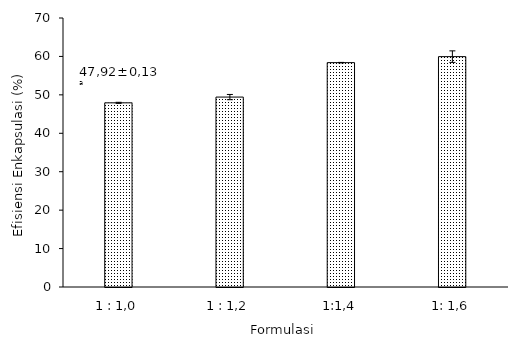
| Category | Efisiensi Enkapsulasi (%) |
|---|---|
| 1 : 1,0 | 47.924 |
| 1 : 1,2 | 49.423 |
| 1:1,4 | 58.385 |
| 1: 1,6 | 59.947 |